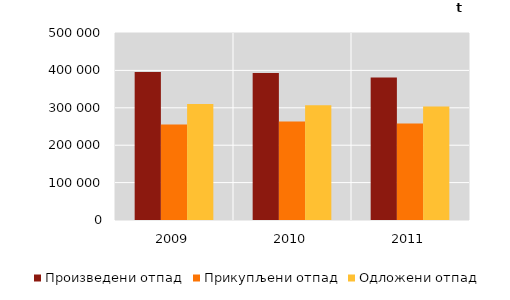
| Category | Произведени отпад | Прикупљени отпад | Одложени отпад |
|---|---|---|---|
| 2009.0 | 395600 | 255034 | 310402 |
| 2010.0 | 392891 | 263646 | 306758 |
| 2011.0 | 381185 | 257716 | 303777 |